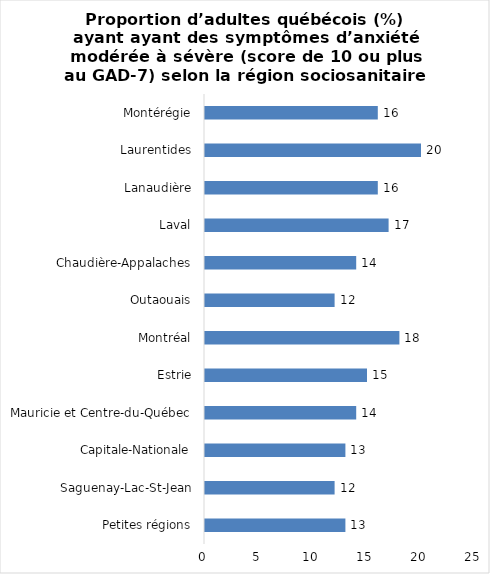
| Category | Series 0 |
|---|---|
| Petites régions | 13 |
| Saguenay-Lac-St-Jean | 12 |
| Capitale-Nationale | 13 |
| Mauricie et Centre-du-Québec | 14 |
| Estrie | 15 |
| Montréal | 18 |
| Outaouais | 12 |
| Chaudière-Appalaches | 14 |
| Laval | 17 |
| Lanaudière | 16 |
| Laurentides | 20 |
| Montérégie | 16 |